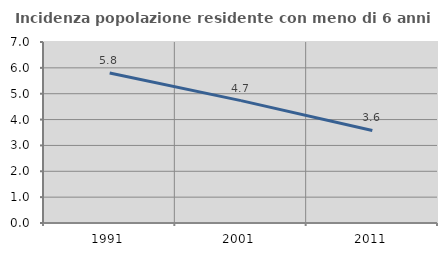
| Category | Incidenza popolazione residente con meno di 6 anni |
|---|---|
| 1991.0 | 5.8 |
| 2001.0 | 4.733 |
| 2011.0 | 3.58 |